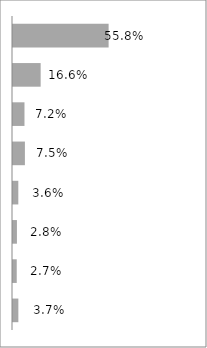
| Category | Series 0 |
|---|---|
| Excel School - Dashboards Membership | 0.558 |
| PM Templates for Excel [2007] | 0.166 |
| Excel School - Download Membership | 0.072 |
| Dashboard Tutorial #1 | 0.075 |
| PM Templates for Excel [both] | 0.036 |
| PM Templates for Excel [2003] | 0.028 |
| Excel School - Online Membership | 0.027 |
| Excel Formula e-book | 0.037 |